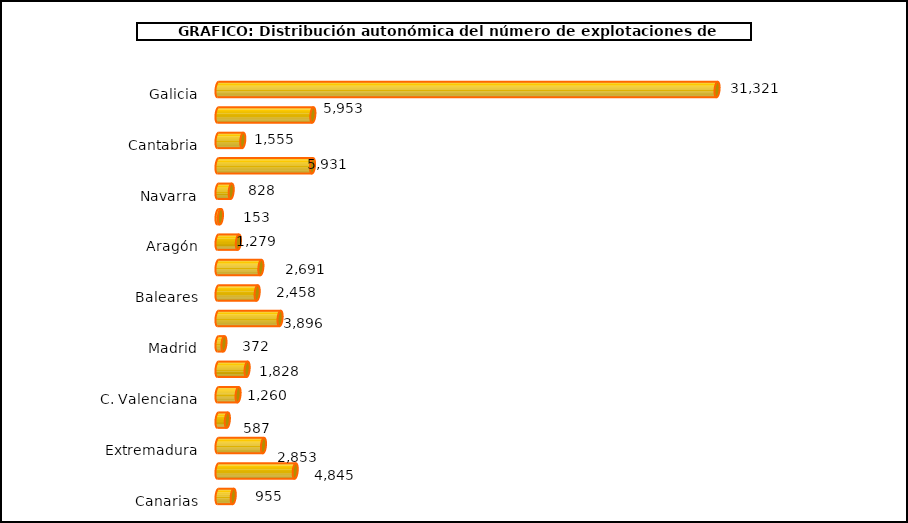
| Category | num. Explotaciones |
|---|---|
|   Galicia | 31321 |
|   P. de Asturias | 5953 |
|   Cantabria | 1555 |
|   País Vasco | 5931 |
|   Navarra | 828 |
|   La Rioja | 153 |
|   Aragón | 1279 |
|   Cataluña | 2691 |
|   Baleares | 2458 |
|   Castilla y León | 3896 |
|   Madrid | 372 |
|   Castilla – La Mancha | 1828 |
|   C. Valenciana | 1260 |
|   R. de Murcia | 587 |
|   Extremadura | 2853 |
|   Andalucía | 4845 |
|   Canarias | 955 |